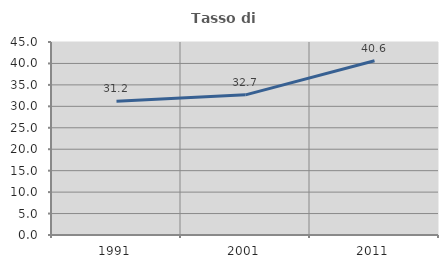
| Category | Tasso di occupazione   |
|---|---|
| 1991.0 | 31.162 |
| 2001.0 | 32.672 |
| 2011.0 | 40.624 |